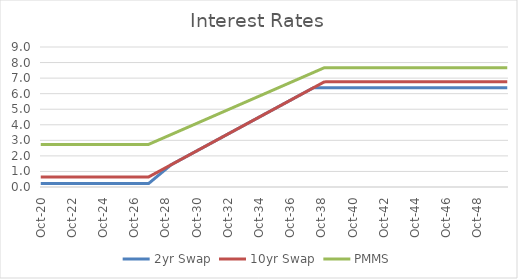
| Category | 2yr Swap | 10yr Swap | PMMS |
|---|---|---|---|
| 2020-10-31 | 0.219 | 0.644 | 2.738 |
| 2020-11-30 | 0.219 | 0.644 | 2.738 |
| 2020-12-31 | 0.219 | 0.644 | 2.738 |
| 2021-01-31 | 0.219 | 0.644 | 2.738 |
| 2021-02-28 | 0.219 | 0.644 | 2.738 |
| 2021-03-31 | 0.219 | 0.644 | 2.738 |
| 2021-04-30 | 0.219 | 0.644 | 2.738 |
| 2021-05-31 | 0.219 | 0.644 | 2.738 |
| 2021-06-30 | 0.219 | 0.644 | 2.738 |
| 2021-07-31 | 0.219 | 0.644 | 2.738 |
| 2021-08-31 | 0.219 | 0.644 | 2.738 |
| 2021-09-30 | 0.219 | 0.644 | 2.738 |
| 2021-10-31 | 0.219 | 0.644 | 2.738 |
| 2021-11-30 | 0.219 | 0.644 | 2.738 |
| 2021-12-31 | 0.219 | 0.644 | 2.738 |
| 2022-01-31 | 0.219 | 0.644 | 2.738 |
| 2022-02-28 | 0.219 | 0.644 | 2.738 |
| 2022-03-31 | 0.219 | 0.644 | 2.738 |
| 2022-04-30 | 0.219 | 0.644 | 2.738 |
| 2022-05-31 | 0.219 | 0.644 | 2.738 |
| 2022-06-30 | 0.219 | 0.644 | 2.738 |
| 2022-07-31 | 0.219 | 0.644 | 2.738 |
| 2022-08-31 | 0.219 | 0.644 | 2.738 |
| 2022-09-30 | 0.219 | 0.644 | 2.738 |
| 2022-10-31 | 0.219 | 0.644 | 2.738 |
| 2022-11-30 | 0.219 | 0.644 | 2.738 |
| 2022-12-31 | 0.219 | 0.644 | 2.738 |
| 2023-01-31 | 0.219 | 0.644 | 2.738 |
| 2023-02-28 | 0.219 | 0.644 | 2.738 |
| 2023-03-31 | 0.219 | 0.644 | 2.738 |
| 2023-04-30 | 0.219 | 0.644 | 2.738 |
| 2023-05-31 | 0.219 | 0.644 | 2.738 |
| 2023-06-30 | 0.219 | 0.644 | 2.738 |
| 2023-07-31 | 0.219 | 0.644 | 2.738 |
| 2023-08-31 | 0.219 | 0.644 | 2.738 |
| 2023-09-30 | 0.219 | 0.644 | 2.738 |
| 2023-10-31 | 0.219 | 0.644 | 2.738 |
| 2023-11-30 | 0.219 | 0.644 | 2.738 |
| 2023-12-31 | 0.219 | 0.644 | 2.738 |
| 2024-01-31 | 0.219 | 0.644 | 2.738 |
| 2024-02-29 | 0.219 | 0.644 | 2.738 |
| 2024-03-31 | 0.219 | 0.644 | 2.738 |
| 2024-04-30 | 0.219 | 0.644 | 2.738 |
| 2024-05-31 | 0.219 | 0.644 | 2.738 |
| 2024-06-30 | 0.219 | 0.644 | 2.738 |
| 2024-07-31 | 0.219 | 0.644 | 2.738 |
| 2024-08-31 | 0.219 | 0.644 | 2.738 |
| 2024-09-30 | 0.219 | 0.644 | 2.738 |
| 2024-10-31 | 0.219 | 0.644 | 2.738 |
| 2024-11-30 | 0.219 | 0.644 | 2.738 |
| 2024-12-31 | 0.219 | 0.644 | 2.738 |
| 2025-01-31 | 0.219 | 0.644 | 2.738 |
| 2025-02-28 | 0.219 | 0.644 | 2.738 |
| 2025-03-31 | 0.219 | 0.644 | 2.738 |
| 2025-04-30 | 0.219 | 0.644 | 2.738 |
| 2025-05-31 | 0.219 | 0.644 | 2.738 |
| 2025-06-30 | 0.219 | 0.644 | 2.738 |
| 2025-07-31 | 0.219 | 0.644 | 2.738 |
| 2025-08-31 | 0.219 | 0.644 | 2.738 |
| 2025-09-30 | 0.219 | 0.644 | 2.738 |
| 2025-10-31 | 0.219 | 0.644 | 2.738 |
| 2025-11-30 | 0.219 | 0.644 | 2.738 |
| 2025-12-31 | 0.219 | 0.644 | 2.738 |
| 2026-01-31 | 0.219 | 0.644 | 2.738 |
| 2026-02-28 | 0.219 | 0.644 | 2.738 |
| 2026-03-31 | 0.219 | 0.644 | 2.738 |
| 2026-04-30 | 0.219 | 0.644 | 2.738 |
| 2026-05-31 | 0.219 | 0.644 | 2.738 |
| 2026-06-30 | 0.219 | 0.644 | 2.738 |
| 2026-07-31 | 0.219 | 0.644 | 2.738 |
| 2026-08-31 | 0.219 | 0.644 | 2.738 |
| 2026-09-30 | 0.219 | 0.644 | 2.738 |
| 2026-10-31 | 0.219 | 0.644 | 2.738 |
| 2026-11-30 | 0.219 | 0.644 | 2.738 |
| 2026-12-31 | 0.219 | 0.644 | 2.738 |
| 2027-01-31 | 0.219 | 0.644 | 2.738 |
| 2027-02-28 | 0.219 | 0.644 | 2.738 |
| 2027-03-31 | 0.219 | 0.644 | 2.738 |
| 2027-04-30 | 0.219 | 0.644 | 2.738 |
| 2027-05-31 | 0.219 | 0.644 | 2.738 |
| 2027-06-30 | 0.219 | 0.644 | 2.738 |
| 2027-07-31 | 0.219 | 0.644 | 2.738 |
| 2027-08-31 | 0.219 | 0.644 | 2.738 |
| 2027-09-30 | 0.219 | 0.644 | 2.738 |
| 2027-10-31 | 0.289 | 0.689 | 2.774 |
| 2027-11-30 | 0.359 | 0.734 | 2.811 |
| 2027-12-31 | 0.428 | 0.78 | 2.847 |
| 2028-01-31 | 0.498 | 0.825 | 2.884 |
| 2028-02-29 | 0.568 | 0.87 | 2.92 |
| 2028-03-31 | 0.637 | 0.915 | 2.957 |
| 2028-04-30 | 0.707 | 0.96 | 2.993 |
| 2028-05-31 | 0.777 | 1.006 | 3.03 |
| 2028-06-30 | 0.847 | 1.051 | 3.066 |
| 2028-07-31 | 0.916 | 1.096 | 3.103 |
| 2028-08-31 | 0.986 | 1.141 | 3.139 |
| 2028-09-30 | 1.056 | 1.186 | 3.176 |
| 2028-10-31 | 1.125 | 1.232 | 3.212 |
| 2028-11-30 | 1.195 | 1.277 | 3.249 |
| 2028-12-31 | 1.265 | 1.322 | 3.285 |
| 2029-01-31 | 1.334 | 1.367 | 3.322 |
| 2029-02-28 | 1.404 | 1.413 | 3.358 |
| 2029-03-31 | 1.458 | 1.458 | 3.395 |
| 2029-04-30 | 1.503 | 1.503 | 3.431 |
| 2029-05-31 | 1.548 | 1.548 | 3.467 |
| 2029-06-30 | 1.593 | 1.593 | 3.504 |
| 2029-07-31 | 1.639 | 1.639 | 3.54 |
| 2029-08-31 | 1.684 | 1.684 | 3.577 |
| 2029-09-30 | 1.729 | 1.729 | 3.613 |
| 2029-10-31 | 1.774 | 1.774 | 3.65 |
| 2029-11-30 | 1.82 | 1.82 | 3.686 |
| 2029-12-31 | 1.865 | 1.865 | 3.723 |
| 2030-01-31 | 1.91 | 1.91 | 3.759 |
| 2030-02-28 | 1.955 | 1.955 | 3.796 |
| 2030-03-31 | 2 | 2 | 3.832 |
| 2030-04-30 | 2.046 | 2.046 | 3.869 |
| 2030-05-31 | 2.091 | 2.091 | 3.905 |
| 2030-06-30 | 2.136 | 2.136 | 3.941 |
| 2030-07-31 | 2.181 | 2.181 | 3.978 |
| 2030-08-31 | 2.227 | 2.227 | 4.014 |
| 2030-09-30 | 2.272 | 2.272 | 4.051 |
| 2030-10-31 | 2.317 | 2.317 | 4.087 |
| 2030-11-30 | 2.362 | 2.362 | 4.124 |
| 2030-12-31 | 2.407 | 2.407 | 4.16 |
| 2031-01-31 | 2.453 | 2.453 | 4.197 |
| 2031-02-28 | 2.498 | 2.498 | 4.233 |
| 2031-03-31 | 2.543 | 2.543 | 4.27 |
| 2031-04-30 | 2.588 | 2.588 | 4.306 |
| 2031-05-31 | 2.634 | 2.634 | 4.343 |
| 2031-06-30 | 2.679 | 2.679 | 4.379 |
| 2031-07-31 | 2.724 | 2.724 | 4.415 |
| 2031-08-31 | 2.769 | 2.769 | 4.452 |
| 2031-09-30 | 2.814 | 2.814 | 4.488 |
| 2031-10-31 | 2.86 | 2.86 | 4.525 |
| 2031-11-30 | 2.905 | 2.905 | 4.561 |
| 2031-12-31 | 2.95 | 2.95 | 4.598 |
| 2032-01-31 | 2.995 | 2.995 | 4.634 |
| 2032-02-29 | 3.041 | 3.041 | 4.671 |
| 2032-03-31 | 3.086 | 3.086 | 4.707 |
| 2032-04-30 | 3.131 | 3.131 | 4.744 |
| 2032-05-31 | 3.176 | 3.176 | 4.78 |
| 2032-06-30 | 3.221 | 3.221 | 4.817 |
| 2032-07-31 | 3.267 | 3.267 | 4.853 |
| 2032-08-31 | 3.312 | 3.312 | 4.889 |
| 2032-09-30 | 3.357 | 3.357 | 4.926 |
| 2032-10-31 | 3.402 | 3.402 | 4.962 |
| 2032-11-30 | 3.448 | 3.448 | 4.999 |
| 2032-12-31 | 3.493 | 3.493 | 5.035 |
| 2033-01-31 | 3.538 | 3.538 | 5.072 |
| 2033-02-28 | 3.583 | 3.583 | 5.108 |
| 2033-03-31 | 3.628 | 3.628 | 5.145 |
| 2033-04-30 | 3.674 | 3.674 | 5.181 |
| 2033-05-31 | 3.719 | 3.719 | 5.218 |
| 2033-06-30 | 3.764 | 3.764 | 5.254 |
| 2033-07-31 | 3.809 | 3.809 | 5.291 |
| 2033-08-31 | 3.855 | 3.855 | 5.327 |
| 2033-09-30 | 3.9 | 3.9 | 5.363 |
| 2033-10-31 | 3.945 | 3.945 | 5.4 |
| 2033-11-30 | 3.99 | 3.99 | 5.436 |
| 2033-12-31 | 4.035 | 4.035 | 5.473 |
| 2034-01-31 | 4.081 | 4.081 | 5.509 |
| 2034-02-28 | 4.126 | 4.126 | 5.546 |
| 2034-03-31 | 4.171 | 4.171 | 5.582 |
| 2034-04-30 | 4.216 | 4.216 | 5.619 |
| 2034-05-31 | 4.261 | 4.261 | 5.655 |
| 2034-06-30 | 4.307 | 4.307 | 5.692 |
| 2034-07-31 | 4.352 | 4.352 | 5.728 |
| 2034-08-31 | 4.397 | 4.397 | 5.765 |
| 2034-09-30 | 4.442 | 4.442 | 5.801 |
| 2034-10-31 | 4.488 | 4.488 | 5.838 |
| 2034-11-30 | 4.533 | 4.533 | 5.874 |
| 2034-12-31 | 4.578 | 4.578 | 5.91 |
| 2035-01-31 | 4.623 | 4.623 | 5.947 |
| 2035-02-28 | 4.668 | 4.668 | 5.983 |
| 2035-03-31 | 4.714 | 4.714 | 6.02 |
| 2035-04-30 | 4.759 | 4.759 | 6.056 |
| 2035-05-31 | 4.804 | 4.804 | 6.093 |
| 2035-06-30 | 4.849 | 4.849 | 6.129 |
| 2035-07-31 | 4.895 | 4.895 | 6.166 |
| 2035-08-31 | 4.94 | 4.94 | 6.202 |
| 2035-09-30 | 4.985 | 4.985 | 6.239 |
| 2035-10-31 | 5.03 | 5.03 | 6.275 |
| 2035-11-30 | 5.075 | 5.075 | 6.312 |
| 2035-12-31 | 5.121 | 5.121 | 6.348 |
| 2036-01-31 | 5.166 | 5.166 | 6.384 |
| 2036-02-29 | 5.211 | 5.211 | 6.421 |
| 2036-03-31 | 5.256 | 5.256 | 6.457 |
| 2036-04-30 | 5.302 | 5.302 | 6.494 |
| 2036-05-31 | 5.347 | 5.347 | 6.53 |
| 2036-06-30 | 5.392 | 5.392 | 6.567 |
| 2036-07-31 | 5.437 | 5.437 | 6.603 |
| 2036-08-31 | 5.482 | 5.482 | 6.64 |
| 2036-09-30 | 5.528 | 5.528 | 6.676 |
| 2036-10-31 | 5.573 | 5.573 | 6.713 |
| 2036-11-30 | 5.618 | 5.618 | 6.749 |
| 2036-12-31 | 5.663 | 5.663 | 6.786 |
| 2037-01-31 | 5.709 | 5.709 | 6.822 |
| 2037-02-28 | 5.754 | 5.754 | 6.858 |
| 2037-03-31 | 5.799 | 5.799 | 6.895 |
| 2037-04-30 | 5.844 | 5.844 | 6.931 |
| 2037-05-31 | 5.889 | 5.889 | 6.968 |
| 2037-06-30 | 5.935 | 5.935 | 7.004 |
| 2037-07-31 | 5.98 | 5.98 | 7.041 |
| 2037-08-31 | 6.025 | 6.025 | 7.077 |
| 2037-09-30 | 6.07 | 6.07 | 7.114 |
| 2037-10-31 | 6.116 | 6.116 | 7.15 |
| 2037-11-30 | 6.161 | 6.161 | 7.187 |
| 2037-12-31 | 6.206 | 6.206 | 7.223 |
| 2038-01-31 | 6.251 | 6.251 | 7.26 |
| 2038-02-28 | 6.296 | 6.296 | 7.296 |
| 2038-03-31 | 6.342 | 6.342 | 7.332 |
| 2038-04-30 | 6.387 | 6.387 | 7.369 |
| 2038-05-31 | 6.387 | 6.432 | 7.405 |
| 2038-06-30 | 6.387 | 6.477 | 7.442 |
| 2038-07-31 | 6.387 | 6.523 | 7.478 |
| 2038-08-31 | 6.387 | 6.568 | 7.515 |
| 2038-09-30 | 6.387 | 6.613 | 7.551 |
| 2038-10-31 | 6.387 | 6.658 | 7.587 |
| 2038-11-30 | 6.387 | 6.703 | 7.624 |
| 2038-12-31 | 6.387 | 6.749 | 7.66 |
| 2039-01-31 | 6.387 | 6.758 | 7.668 |
| 2039-02-28 | 6.387 | 6.758 | 7.668 |
| 2039-03-31 | 6.387 | 6.758 | 7.668 |
| 2039-04-30 | 6.387 | 6.758 | 7.668 |
| 2039-05-31 | 6.387 | 6.758 | 7.668 |
| 2039-06-30 | 6.387 | 6.758 | 7.668 |
| 2039-07-31 | 6.387 | 6.758 | 7.668 |
| 2039-08-31 | 6.387 | 6.758 | 7.668 |
| 2039-09-30 | 6.387 | 6.758 | 7.668 |
| 2039-10-31 | 6.387 | 6.758 | 7.668 |
| 2039-11-30 | 6.387 | 6.758 | 7.668 |
| 2039-12-31 | 6.387 | 6.758 | 7.668 |
| 2040-01-31 | 6.387 | 6.758 | 7.668 |
| 2040-02-29 | 6.387 | 6.758 | 7.668 |
| 2040-03-31 | 6.387 | 6.758 | 7.668 |
| 2040-04-30 | 6.387 | 6.758 | 7.668 |
| 2040-05-31 | 6.387 | 6.758 | 7.668 |
| 2040-06-30 | 6.387 | 6.758 | 7.668 |
| 2040-07-31 | 6.387 | 6.758 | 7.668 |
| 2040-08-31 | 6.387 | 6.758 | 7.668 |
| 2040-09-30 | 6.387 | 6.758 | 7.668 |
| 2040-10-31 | 6.387 | 6.758 | 7.668 |
| 2040-11-30 | 6.387 | 6.758 | 7.668 |
| 2040-12-31 | 6.387 | 6.758 | 7.668 |
| 2041-01-31 | 6.387 | 6.758 | 7.668 |
| 2041-02-28 | 6.387 | 6.758 | 7.668 |
| 2041-03-31 | 6.387 | 6.758 | 7.668 |
| 2041-04-30 | 6.387 | 6.758 | 7.668 |
| 2041-05-31 | 6.387 | 6.758 | 7.668 |
| 2041-06-30 | 6.387 | 6.758 | 7.668 |
| 2041-07-31 | 6.387 | 6.758 | 7.668 |
| 2041-08-31 | 6.387 | 6.758 | 7.668 |
| 2041-09-30 | 6.387 | 6.758 | 7.668 |
| 2041-10-31 | 6.387 | 6.758 | 7.668 |
| 2041-11-30 | 6.387 | 6.758 | 7.668 |
| 2041-12-31 | 6.387 | 6.758 | 7.668 |
| 2042-01-31 | 6.387 | 6.758 | 7.668 |
| 2042-02-28 | 6.387 | 6.758 | 7.668 |
| 2042-03-31 | 6.387 | 6.758 | 7.668 |
| 2042-04-30 | 6.387 | 6.758 | 7.668 |
| 2042-05-31 | 6.387 | 6.758 | 7.668 |
| 2042-06-30 | 6.387 | 6.758 | 7.668 |
| 2042-07-31 | 6.387 | 6.758 | 7.668 |
| 2042-08-31 | 6.387 | 6.758 | 7.668 |
| 2042-09-30 | 6.387 | 6.758 | 7.668 |
| 2042-10-31 | 6.387 | 6.758 | 7.668 |
| 2042-11-30 | 6.387 | 6.758 | 7.668 |
| 2042-12-31 | 6.387 | 6.758 | 7.668 |
| 2043-01-31 | 6.387 | 6.758 | 7.668 |
| 2043-02-28 | 6.387 | 6.758 | 7.668 |
| 2043-03-31 | 6.387 | 6.758 | 7.668 |
| 2043-04-30 | 6.387 | 6.758 | 7.668 |
| 2043-05-31 | 6.387 | 6.758 | 7.668 |
| 2043-06-30 | 6.387 | 6.758 | 7.668 |
| 2043-07-31 | 6.387 | 6.758 | 7.668 |
| 2043-08-31 | 6.387 | 6.758 | 7.668 |
| 2043-09-30 | 6.387 | 6.758 | 7.668 |
| 2043-10-31 | 6.387 | 6.758 | 7.668 |
| 2043-11-30 | 6.387 | 6.758 | 7.668 |
| 2043-12-31 | 6.387 | 6.758 | 7.668 |
| 2044-01-31 | 6.387 | 6.758 | 7.668 |
| 2044-02-29 | 6.387 | 6.758 | 7.668 |
| 2044-03-31 | 6.387 | 6.758 | 7.668 |
| 2044-04-30 | 6.387 | 6.758 | 7.668 |
| 2044-05-31 | 6.387 | 6.758 | 7.668 |
| 2044-06-30 | 6.387 | 6.758 | 7.668 |
| 2044-07-31 | 6.387 | 6.758 | 7.668 |
| 2044-08-31 | 6.387 | 6.758 | 7.668 |
| 2044-09-30 | 6.387 | 6.758 | 7.668 |
| 2044-10-31 | 6.387 | 6.758 | 7.668 |
| 2044-11-30 | 6.387 | 6.758 | 7.668 |
| 2044-12-31 | 6.387 | 6.758 | 7.668 |
| 2045-01-31 | 6.387 | 6.758 | 7.668 |
| 2045-02-28 | 6.387 | 6.758 | 7.668 |
| 2045-03-31 | 6.387 | 6.758 | 7.668 |
| 2045-04-30 | 6.387 | 6.758 | 7.668 |
| 2045-05-31 | 6.387 | 6.758 | 7.668 |
| 2045-06-30 | 6.387 | 6.758 | 7.668 |
| 2045-07-31 | 6.387 | 6.758 | 7.668 |
| 2045-08-31 | 6.387 | 6.758 | 7.668 |
| 2045-09-30 | 6.387 | 6.758 | 7.668 |
| 2045-10-31 | 6.387 | 6.758 | 7.668 |
| 2045-11-30 | 6.387 | 6.758 | 7.668 |
| 2045-12-31 | 6.387 | 6.758 | 7.668 |
| 2046-01-31 | 6.387 | 6.758 | 7.668 |
| 2046-02-28 | 6.387 | 6.758 | 7.668 |
| 2046-03-31 | 6.387 | 6.758 | 7.668 |
| 2046-04-30 | 6.387 | 6.758 | 7.668 |
| 2046-05-31 | 6.387 | 6.758 | 7.668 |
| 2046-06-30 | 6.387 | 6.758 | 7.668 |
| 2046-07-31 | 6.387 | 6.758 | 7.668 |
| 2046-08-31 | 6.387 | 6.758 | 7.668 |
| 2046-09-30 | 6.387 | 6.758 | 7.668 |
| 2046-10-31 | 6.387 | 6.758 | 7.668 |
| 2046-11-30 | 6.387 | 6.758 | 7.668 |
| 2046-12-31 | 6.387 | 6.758 | 7.668 |
| 2047-01-31 | 6.387 | 6.758 | 7.668 |
| 2047-02-28 | 6.387 | 6.758 | 7.668 |
| 2047-03-31 | 6.387 | 6.758 | 7.668 |
| 2047-04-30 | 6.387 | 6.758 | 7.668 |
| 2047-05-31 | 6.387 | 6.758 | 7.668 |
| 2047-06-30 | 6.387 | 6.758 | 7.668 |
| 2047-07-31 | 6.387 | 6.758 | 7.668 |
| 2047-08-31 | 6.387 | 6.758 | 7.668 |
| 2047-09-30 | 6.387 | 6.758 | 7.668 |
| 2047-10-31 | 6.387 | 6.758 | 7.668 |
| 2047-11-30 | 6.387 | 6.758 | 7.668 |
| 2047-12-31 | 6.387 | 6.758 | 7.668 |
| 2048-01-31 | 6.387 | 6.758 | 7.668 |
| 2048-02-29 | 6.387 | 6.758 | 7.668 |
| 2048-03-31 | 6.387 | 6.758 | 7.668 |
| 2048-04-30 | 6.387 | 6.758 | 7.668 |
| 2048-05-31 | 6.387 | 6.758 | 7.668 |
| 2048-06-30 | 6.387 | 6.758 | 7.668 |
| 2048-07-31 | 6.387 | 6.758 | 7.668 |
| 2048-08-31 | 6.387 | 6.758 | 7.668 |
| 2048-09-30 | 6.387 | 6.758 | 7.668 |
| 2048-10-31 | 6.387 | 6.758 | 7.668 |
| 2048-11-30 | 6.387 | 6.758 | 7.668 |
| 2048-12-31 | 6.387 | 6.758 | 7.668 |
| 2049-01-31 | 6.387 | 6.758 | 7.668 |
| 2049-02-28 | 6.387 | 6.758 | 7.668 |
| 2049-03-31 | 6.387 | 6.758 | 7.668 |
| 2049-04-30 | 6.387 | 6.758 | 7.668 |
| 2049-05-31 | 6.387 | 6.758 | 7.668 |
| 2049-06-30 | 6.387 | 6.758 | 7.668 |
| 2049-07-31 | 6.387 | 6.758 | 7.668 |
| 2049-08-31 | 6.387 | 6.758 | 7.668 |
| 2049-09-30 | 6.387 | 6.758 | 7.668 |
| 2049-10-31 | 6.387 | 6.758 | 7.668 |
| 2049-11-30 | 6.387 | 6.758 | 7.668 |
| 2049-12-31 | 6.387 | 6.758 | 7.668 |
| 2050-01-31 | 6.387 | 6.758 | 7.668 |
| 2050-02-28 | 6.387 | 6.758 | 7.668 |
| 2050-03-31 | 6.387 | 6.758 | 7.668 |
| 2050-04-30 | 6.387 | 6.758 | 7.668 |
| 2050-05-31 | 6.387 | 6.758 | 7.668 |
| 2050-06-30 | 6.387 | 6.758 | 7.668 |
| 2050-07-31 | 6.387 | 6.758 | 7.668 |
| 2050-08-31 | 6.387 | 6.758 | 7.668 |
| 2050-09-30 | 6.387 | 6.758 | 7.668 |